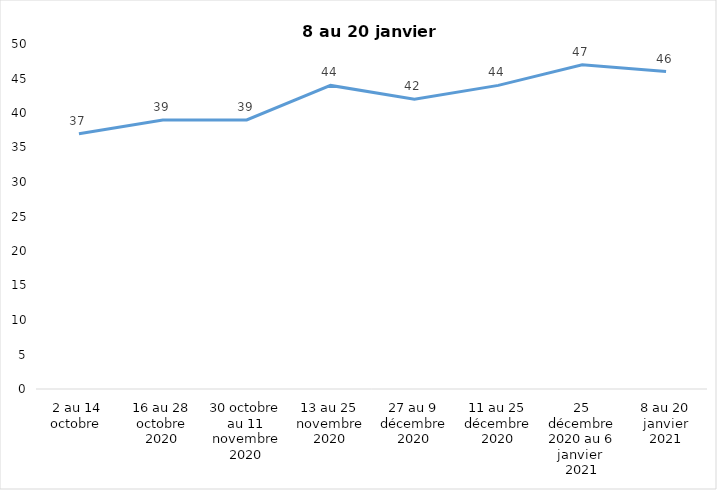
| Category | Toujours aux trois mesures |
|---|---|
| 2 au 14 octobre  | 37 |
| 16 au 28 octobre 2020 | 39 |
| 30 octobre au 11 novembre 2020 | 39 |
| 13 au 25 novembre 2020 | 44 |
| 27 au 9 décembre 2020 | 42 |
| 11 au 25 décembre 2020 | 44 |
| 25 décembre 2020 au 6 janvier  2021 | 47 |
| 8 au 20 janvier 2021 | 46 |